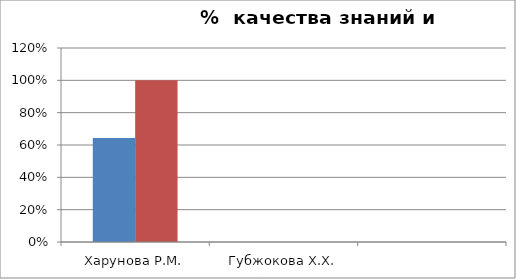
| Category | Series 0 | 2 |
|---|---|---|
| Харунова Р.М. | 0.643 | 1 |
| Губжокова Х.Х. | 0 | 0 |